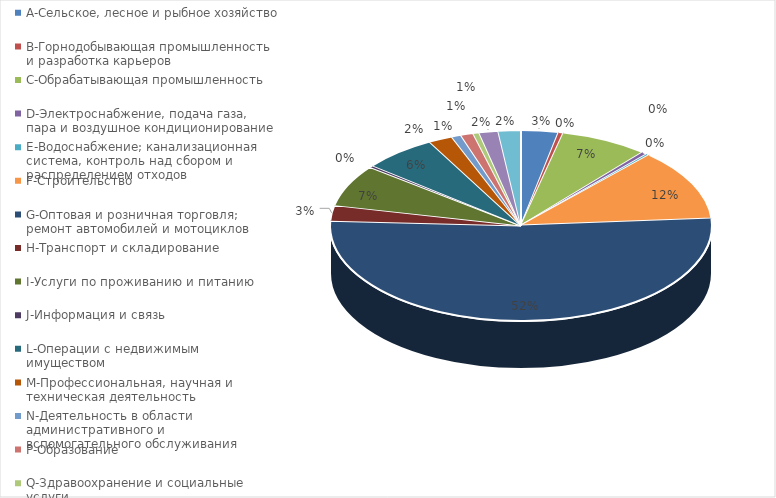
| Category | Series 0 |
|---|---|
| A-Сельское, лесное и рыбное хозяйство | 0.032 |
| B-Горнодобывающая промышленность и разработка карьеров | 0.004 |
| C-Обрабатывающая промышленность | 0.074 |
| D-Электроснабжение, подача газа, пара и воздушное кондиционирование | 0.005 |
| E-Водоснабжение; канализационная система, контроль над сбором и распределением отходов | 0.002 |
| F-Строительство | 0.121 |
| G-Оптовая и розничная торговля; ремонт автомобилей и мотоциклов | 0.52 |
| H-Транспорт и складирование | 0.026 |
| I-Услуги по проживанию и питанию | 0.071 |
| J-Информация и связь | 0.003 |
| L-Операции с недвижимым имуществом | 0.062 |
| M-Профессиональная, научная и техническая деятельность | 0.02 |
| N-Деятельность в области административного и вспомогательного обслуживания | 0.008 |
| P-Образование | 0.011 |
| Q-Здравоохранение и социальные услуги | 0.005 |
| R-Искусство, развлечения и отдых | 0.016 |
| S-Предоставление прочих видов услуг | 0.019 |